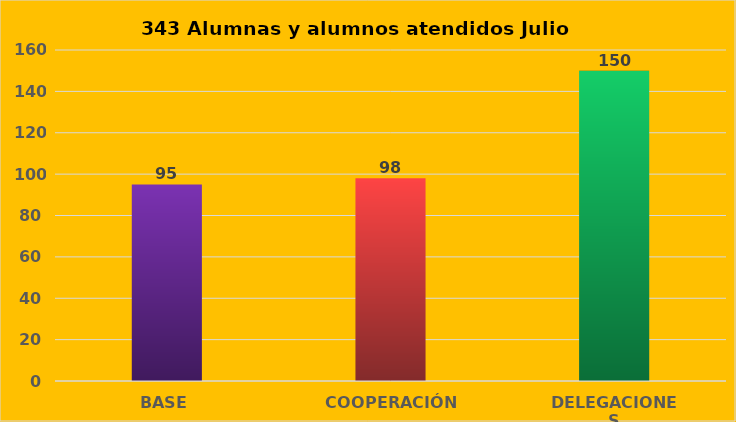
| Category | Series 0 |
|---|---|
| BASE | 95 |
| COOPERACIÓN | 98 |
| DELEGACIONES | 150 |